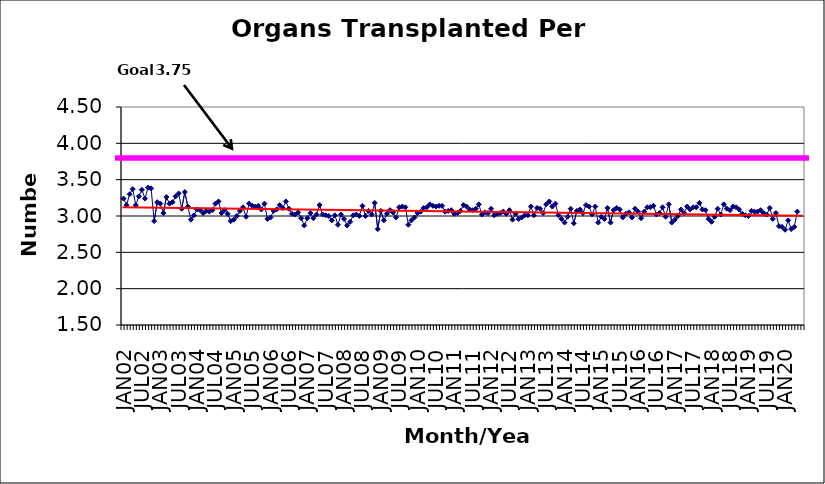
| Category | Series 0 |
|---|---|
| JAN02 | 3.24 |
| FEB02 | 3.15 |
| MAR02 | 3.3 |
| APR02 | 3.37 |
| MAY02 | 3.15 |
| JUN02 | 3.27 |
| JUL02 | 3.36 |
| AUG02 | 3.24 |
| SEP02 | 3.39 |
| OCT02 | 3.38 |
| NOV02 | 2.93 |
| DEC02 | 3.19 |
| JAN03 | 3.17 |
| FEB03 | 3.04 |
| MAR03 | 3.26 |
| APR03 | 3.17 |
| MAY03 | 3.19 |
| JUN03 | 3.27 |
| JUL03 | 3.31 |
| AUG03 | 3.1 |
| SEP03 | 3.33 |
| OCT03 | 3.13 |
| NOV03 | 2.95 |
| DEC03 | 3.01 |
| JAN04 | 3.09 |
| FEB04 | 3.08 |
| MAR04 | 3.04 |
| APR04 | 3.07 |
| MAY04 | 3.06 |
| JUN04 | 3.08 |
| JUL04 | 3.17 |
| AUG04 | 3.2 |
| SEP04 | 3.04 |
| OCT04 | 3.08 |
| NOV04 | 3.03 |
| DEC04 | 2.93 |
| JAN05 | 2.95 |
| FEB05 | 3 |
| MAR05 | 3.07 |
| APR05 | 3.12 |
| MAY05 | 2.99 |
| JUN05 | 3.17 |
| JUL05 | 3.14 |
| AUG05 | 3.13 |
| SEP05 | 3.14 |
| OCT05 | 3.09 |
| NOV05 | 3.17 |
| DEC05 | 2.96 |
| JAN06 | 2.98 |
| FEB06 | 3.07 |
| MAR06 | 3.09 |
| APR06 | 3.15 |
| MAY06 | 3.11 |
| JUN06 | 3.2 |
| JUL06 | 3.1 |
| AUG06 | 3.03 |
| SEP06 | 3.02 |
| OCT06 | 3.05 |
| NOV06 | 2.97 |
| DEC06 | 2.87 |
| JAN07 | 2.97 |
| FEB07 | 3.04 |
| MAR07 | 2.97 |
| APR07 | 3.02 |
| MAY07 | 3.15 |
| JUN07 | 3.02 |
| JUL07 | 3.01 |
| AUG07 | 3 |
| SEP07 | 2.94 |
| OCT07 | 3.01 |
| NOV07 | 2.88 |
| DEC07 | 3.02 |
| JAN08 | 2.96 |
| FEB08 | 2.87 |
| MAR08 | 2.92 |
| APR08 | 3.01 |
| MAY08 | 3.02 |
| JUN08 | 3 |
| JUL08 | 3.14 |
| AUG08 | 3 |
| SEP08 | 3.07 |
| OCT08 | 3.02 |
| NOV08 | 3.18 |
| DEC08 | 2.82 |
| JAN09 | 3.07 |
| FEB09 | 2.94 |
| MAR09 | 3.03 |
| APR09 | 3.08 |
| MAY09 | 3.05 |
| JUN09 | 2.98 |
| JUL09 | 3.12 |
| AUG09 | 3.13 |
| SEP09 | 3.12 |
| OCT09 | 2.88 |
| NOV09 | 2.94 |
| DEC09 | 2.98 |
| JAN10 | 3.04 |
| FEB10 | 3.06 |
| MAR10 | 3.11 |
| APR10 | 3.12 |
| MAY10 | 3.16 |
| JUN10 | 3.14 |
| JUL10 | 3.13 |
| AUG10 | 3.14 |
| SEP10 | 3.14 |
| OCT10 | 3.06 |
| NOV10 | 3.07 |
| DEC10 | 3.08 |
| JAN11 | 3.03 |
| FEB11 | 3.04 |
| MAR11 | 3.07 |
| APR11 | 3.15 |
| MAY11 | 3.13 |
| JUN11 | 3.09 |
| JUL11 | 3.08 |
| AUG11 | 3.1 |
| SEP11 | 3.16 |
| OCT11 | 3.02 |
| NOV11 | 3.05 |
| DEC11 | 3.04 |
| JAN12 | 3.1 |
| FEB12 | 3.01 |
| MAR12 | 3.03 |
| APR12 | 3.04 |
| MAY12 | 3.06 |
| JUN12 | 3.03 |
| JUL12 | 3.08 |
| AUG12 | 2.95 |
| SEP12 | 3.03 |
| OCT12 | 2.96 |
| NOV12 | 2.98 |
| DEC12 | 3.01 |
| JAN13 | 3.01 |
| FEB13 | 3.13 |
| MAR13 | 3.01 |
| APR13 | 3.11 |
| MAY13 | 3.1 |
| JUN13 | 3.04 |
| JUL13 | 3.16 |
| AUG13 | 3.2 |
| SEP13 | 3.13 |
| OCT13 | 3.17 |
| NOV13 | 3.01 |
| DEC13 | 2.96 |
| JAN14 | 2.91 |
| FEB14 | 2.99 |
| MAR14 | 3.1 |
| APR14 | 2.9 |
| MAY14 | 3.07 |
| JUN14 | 3.09 |
| JUL14 | 3.04 |
| AUG14 | 3.15 |
| SEP14 | 3.13 |
| OCT14 | 3.02 |
| NOV14 | 3.13 |
| DEC14 | 2.91 |
| JAN15 | 2.99 |
| FEB15 | 2.96 |
| MAR15 | 3.11 |
| APR15 | 2.91 |
| MAY15 | 3.08 |
| JUN15 | 3.11 |
| JUL15 | 3.09 |
| AUG15 | 2.98 |
| SEP15 | 3.03 |
| OCT15 | 3.05 |
| NOV15 | 2.98 |
| DEC15 | 3.1 |
| JAN16 | 3.06 |
| FEB16 | 2.97 |
| MAR16 | 3.06 |
| APR16 | 3.12 |
| MAY16 | 3.12 |
| JUN16 | 3.14 |
| JUL16 | 3.02 |
| AUG16 | 3.04 |
| SEP16 | 3.12 |
| OCT16 | 2.99 |
| NOV16 | 3.16 |
| DEC16 | 2.91 |
| JAN17 | 2.95 |
| FEB17 | 3 |
| MAR17 | 3.09 |
| APR17 | 3.04 |
| MAY17 | 3.13 |
| JUN17 | 3.09 |
| JUL17 | 3.12 |
| AUG17 | 3.12 |
| SEP17 | 3.18 |
| OCT17 | 3.09 |
| NOV17 | 3.08 |
| DEC17 | 2.96 |
| JAN18 | 2.92 |
| FEB18 | 2.99 |
| MAR18 | 3.1 |
| APR18 | 3.02 |
| MAY18 | 3.16 |
| JUN18 | 3.1 |
| JUL18 | 3.08 |
| AUG18 | 3.13 |
| SEP18 | 3.12 |
| OCT18 | 3.09 |
| NOV18 | 3.03 |
| DEC18 | 3.01 |
| JAN19 | 3 |
| FEB19 | 3.07 |
| MAR19 | 3.06 |
| APR19 | 3.06 |
| MAY19 | 3.08 |
| JUN19 | 3.04 |
| JUL19 | 3.02 |
| AUG19 | 3.11 |
| SEP19 | 2.96 |
| OCT19 | 3.04 |
| NOV19 | 2.86 |
| DEC19 | 2.85 |
| JAN20 | 2.81 |
| FEB20 | 2.94 |
| MAR20 | 2.82 |
| APR20 | 2.85 |
| MAY20 | 3.06 |